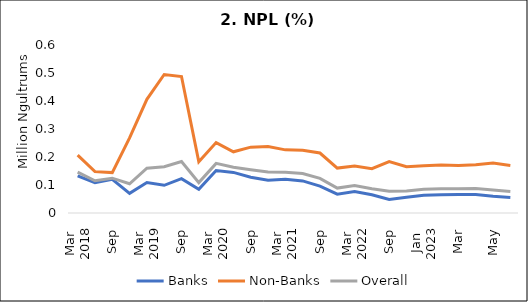
| Category | Banks | Non-Banks | Overall |
|---|---|---|---|
| 0 | 0.133 | 0.207 | 0.146 |
| 1 | 0.108 | 0.148 | 0.115 |
| 2 | 0.12 | 0.144 | 0.124 |
| 3 | 0.07 | 0.268 | 0.104 |
| 4 | 0.109 | 0.406 | 0.16 |
| 5 | 0.099 | 0.495 | 0.165 |
| 6 | 0.123 | 0.487 | 0.184 |
| 7 | 0.084 | 0.183 | 0.109 |
| 8 | 0.152 | 0.251 | 0.177 |
| 9 | 0.145 | 0.218 | 0.164 |
| 10 | 0.128 | 0.235 | 0.154 |
| 11 | 0.117 | 0.237 | 0.146 |
| 12 | 0.121 | 0.226 | 0.146 |
| 13 | 0.115 | 0.224 | 0.141 |
| 14 | 0.096 | 0.214 | 0.124 |
| 15 | 0.067 | 0.16 | 0.089 |
| 16 | 0.077 | 0.168 | 0.098 |
| 17 | 0.065 | 0.158 | 0.086 |
| 18 | 0.048 | 0.183 | 0.078 |
| 19 | 0.057 | 0.165 | 0.079 |
| 20 | 0.063 | 0.169 | 0.085 |
| 21 | 0.065 | 0.171 | 0.086 |
| 22 | 0.066 | 0.169 | 0.087 |
| 23 | 0.066 | 0.173 | 0.087 |
| 24 | 0.06 | 0.178 | 0.082 |
| 25 | 0.055 | 0.17 | 0.077 |